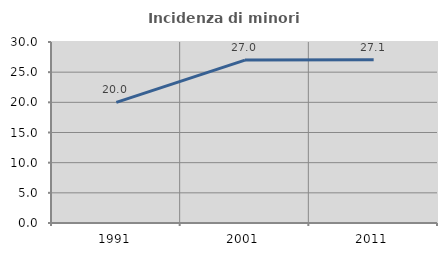
| Category | Incidenza di minori stranieri |
|---|---|
| 1991.0 | 20 |
| 2001.0 | 27 |
| 2011.0 | 27.078 |